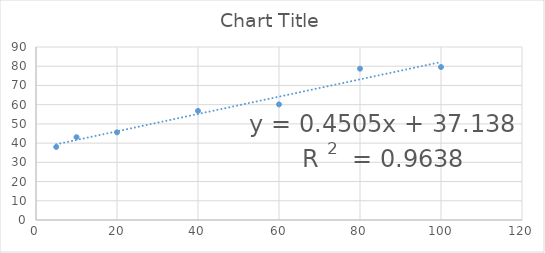
| Category | Series 0 |
|---|---|
| 5.0 | 38.007 |
| 10.0 | 43.074 |
| 20.0 | 45.608 |
| 40.0 | 56.757 |
| 60.0 | 60.135 |
| 80.0 | 78.716 |
| 100.0 | 79.561 |